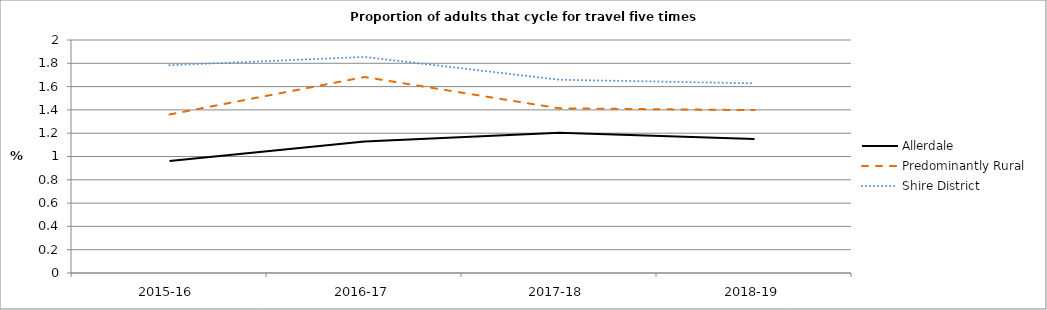
| Category | Allerdale | Predominantly Rural | Shire District |
|---|---|---|---|
| 2015-16 | 0.962 | 1.361 | 1.783 |
| 2016-17 | 1.128 | 1.682 | 1.854 |
| 2017-18 | 1.204 | 1.413 | 1.659 |
| 2018-19 | 1.151 | 1.398 | 1.628 |